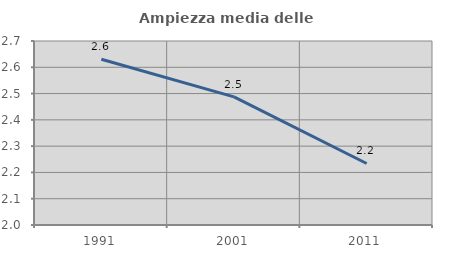
| Category | Ampiezza media delle famiglie |
|---|---|
| 1991.0 | 2.63 |
| 2001.0 | 2.487 |
| 2011.0 | 2.234 |